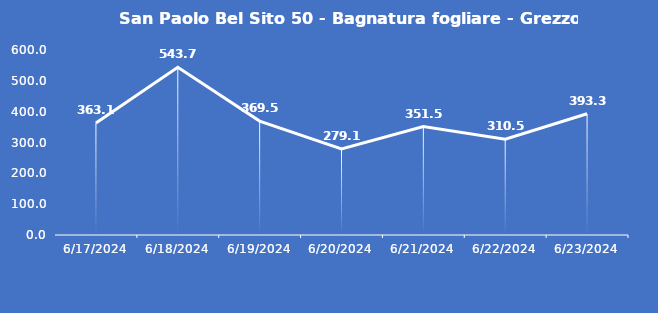
| Category | San Paolo Bel Sito 50 - Bagnatura fogliare - Grezzo (min) |
|---|---|
| 6/17/24 | 363.1 |
| 6/18/24 | 543.7 |
| 6/19/24 | 369.5 |
| 6/20/24 | 279.1 |
| 6/21/24 | 351.5 |
| 6/22/24 | 310.5 |
| 6/23/24 | 393.3 |